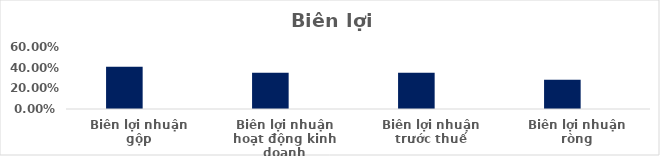
| Category | Series 0 | Series 1 | Series 2 | Series 3 | Series 4 |
|---|---|---|---|---|---|
| Biên lợi nhuận gộp | 0.409 |  |  |  |  |
| Biên lợi nhuận hoạt động kinh doanh | 0.351 |  |  |  |  |
| Biên lợi nhuận trước thuế | 0.35 |  |  |  |  |
| Biên lợi nhuận ròng | 0.284 |  |  |  |  |